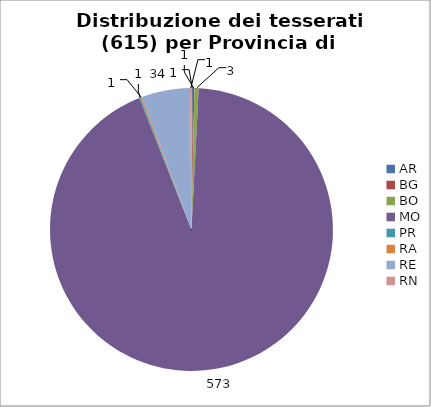
| Category | Nr. Tesserati |
|---|---|
| AR | 1 |
| BG | 1 |
| BO | 3 |
| MO | 573 |
| PR | 1 |
| RA | 1 |
| RE | 34 |
| RN | 1 |